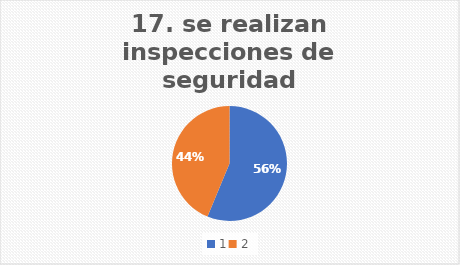
| Category | se realizan inspecciones de seguridad peirodicamente? |
|---|---|
| 0 | 56.25 |
| 1 | 43.75 |